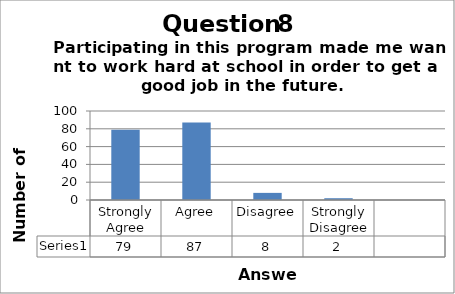
| Category | Series 0 |
|---|---|
| Strongly Agree | 79 |
| Agree | 87 |
| Disagree | 8 |
| Strongly Disagree | 2 |